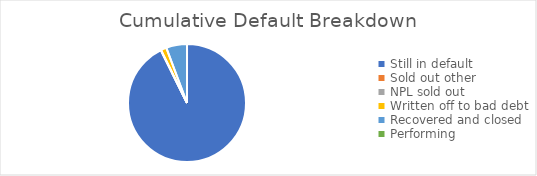
| Category | Cumulative Default Breakdown |
|---|---|
| Still in default | 0.927 |
| Sold out other | 0 |
| NPL sold out | 0 |
| Written off to bad debt | 0.016 |
| Recovered and closed | 0.057 |
| Performing | 0 |